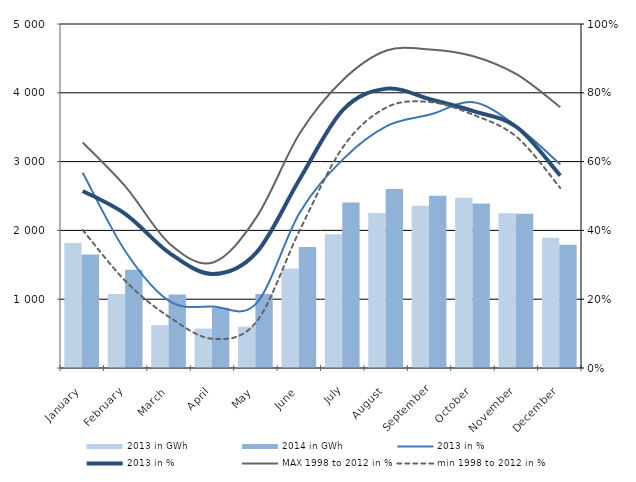
| Category | 2013 in GWh | 2014 in GWh |
|---|---|---|
| January | 1818.028 | 1648.916 |
| February | 1075.975 | 1429.205 |
| March | 622.825 | 1070.023 |
| April | 572.573 | 875.146 |
| May | 601.133 | 1073.946 |
| June | 1447.499 | 1760.203 |
| July | 1945.075 | 2405.455 |
| August | 2252.266 | 2601.171 |
| September | 2359.542 | 2502.075 |
| October | 2473.578 | 2391.728 |
| November | 2249.47 | 2241.545 |
| December | 1894.845 | 1791.734 |